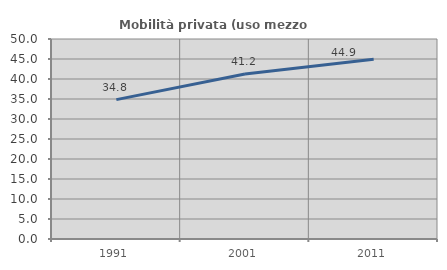
| Category | Mobilità privata (uso mezzo privato) |
|---|---|
| 1991.0 | 34.838 |
| 2001.0 | 41.247 |
| 2011.0 | 44.909 |